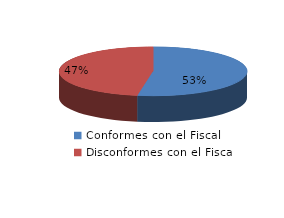
| Category | Series 0 |
|---|---|
| 0 | 50 |
| 1 | 45 |